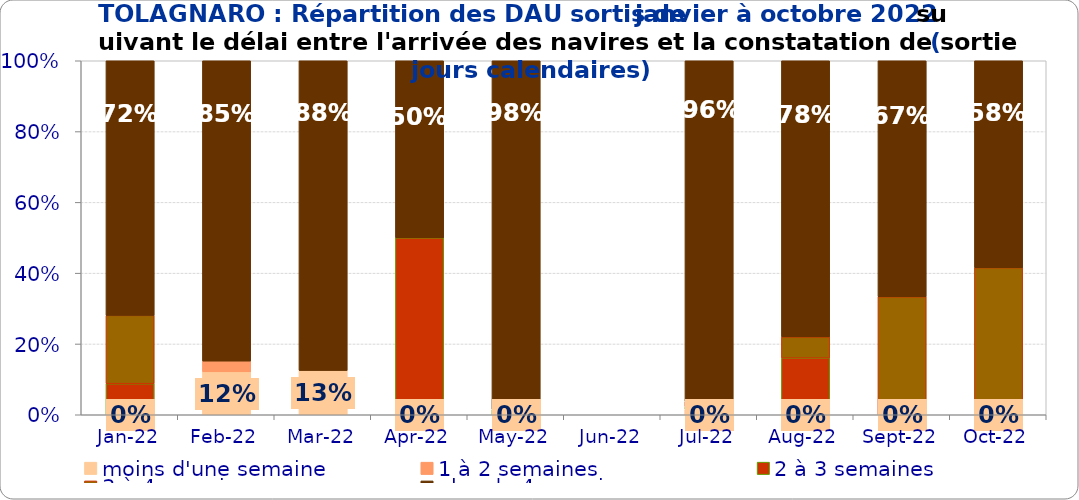
| Category | moins d'une semaine | 1 à 2 semaines | 2 à 3 semaines | 3 à 4 semaines | plus de 4 semaines |
|---|---|---|---|---|---|
| 2022-01-01 | 0 | 0 | 0.088 | 0.193 | 0.719 |
| 2022-02-01 | 0.121 | 0.03 | 0 | 0 | 0.848 |
| 2022-03-01 | 0.125 | 0 | 0 | 0 | 0.875 |
| 2022-04-01 | 0 | 0 | 0.5 | 0 | 0.5 |
| 2022-05-01 | 0 | 0 | 0.015 | 0 | 0.985 |
| 2022-06-01 | 0 | 0 | 0 | 0 | 0 |
| 2022-07-01 | 0 | 0.015 | 0.007 | 0.015 | 0.963 |
| 2022-08-01 | 0 | 0 | 0.16 | 0.06 | 0.78 |
| 2022-09-01 | 0 | 0 | 0 | 0.333 | 0.667 |
| 2022-10-01 | 0 | 0.039 | 0 | 0.377 | 0.584 |